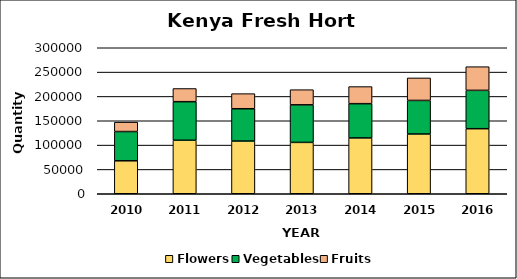
| Category | Flowers | Vegetables | Fruits  |
|---|---|---|---|
| 2010.0 | 67731 | 60090 | 19313 |
| 2011.0 | 109950 | 79246 | 27051 |
| 2012.0 | 108306 | 66352 | 31070 |
| 2013.0 | 105554 | 77172 | 31107 |
| 2014.0 | 114764 | 70335 | 35149 |
| 2015.0 | 122825 | 68942 | 46246 |
| 2016.0 | 133658 | 78791 | 48658 |